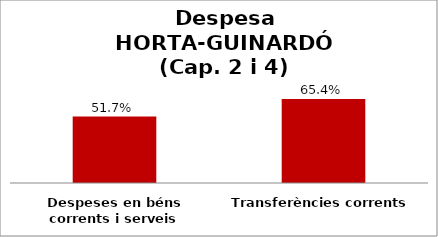
| Category | Series 0 |
|---|---|
| Despeses en béns corrents i serveis | 0.517 |
| Transferències corrents | 0.654 |